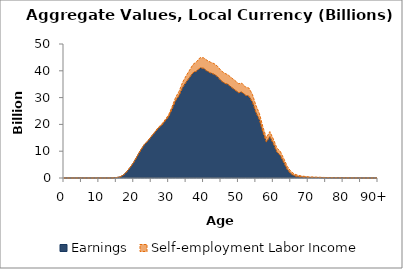
| Category | Earnings | Self-employment Labor Income |
|---|---|---|
| 0 | 0 | 0 |
|  | 0.232 | 0 |
| 2 | 0 | 0 |
| 3 | 0 | 0 |
| 4 | 0.258 | 0 |
| 5 | 0 | 0 |
| 6 | 0.276 | 0.018 |
| 7 | 0.27 | 0 |
| 8 | 0.402 | 0 |
| 9 | 0.326 | 0.056 |
| 10 | 0.452 | 0 |
| 11 | 1.245 | 0.132 |
| 12 | 2.804 | 0.204 |
| 13 | 11.63 | 0.335 |
| 14 | 42.006 | 0.494 |
| 15 | 140.448 | 0.757 |
| 16 | 396.694 | 1.031 |
| 17 | 1054.736 | 1.874 |
| 18 | 2357.46 | 3.252 |
| 19 | 4022.095 | 6.236 |
| 20 | 5855.473 | 10.051 |
| 21 | 8178.244 | 19.518 |
| 22 | 10426.908 | 31.125 |
| 23 | 12424.86 | 52.301 |
| 24 | 13749.482 | 77.743 |
| 25 | 15376.735 | 130.123 |
| 26 | 16923.78 | 210.942 |
| 27 | 18553.115 | 288.292 |
| 28 | 19666.591 | 400.875 |
| 29 | 21271.078 | 514.758 |
| 30 | 22908.288 | 684.786 |
| 31 | 25766.152 | 934.982 |
| 32 | 28871.231 | 1216.348 |
| 33 | 30834.441 | 1542.579 |
| 34 | 33762.702 | 1949.983 |
| 35 | 35733.157 | 2384.905 |
| 36 | 37502.622 | 2753.986 |
| 37 | 39287.086 | 3114.801 |
| 38 | 39905.763 | 3485.902 |
| 39 | 41053.173 | 3851.885 |
| 40 | 40905.181 | 3955.821 |
| 41 | 39895.702 | 4002.395 |
| 42 | 39186.611 | 4020.056 |
| 43 | 38706.688 | 3985.722 |
| 44 | 37817.728 | 3895.958 |
| 45 | 36306.085 | 3787.532 |
| 46 | 35390.489 | 3724.386 |
| 47 | 34917.718 | 3592.681 |
| 48 | 33833.323 | 3549.921 |
| 49 | 32844.412 | 3532.888 |
| 50 | 31840.739 | 3391.011 |
| 51 | 32065.454 | 3289.361 |
| 52 | 30901.319 | 3075.904 |
| 53 | 30497.272 | 3069.514 |
| 54 | 28384.277 | 2836.532 |
| 55 | 24511.76 | 2594.121 |
| 56 | 21738.266 | 2345.625 |
| 57 | 17117.064 | 2007.774 |
| 58 | 13399.36 | 1603.993 |
| 59 | 15447.971 | 1875.001 |
| 60 | 12820.52 | 1731.388 |
| 61 | 9749.589 | 1467.05 |
| 62 | 8391.061 | 1530.512 |
| 63 | 5793.156 | 1432.199 |
| 64 | 3185.905 | 1170.5 |
| 65 | 1625.534 | 860.788 |
| 66 | 841.041 | 653.503 |
| 67 | 515.609 | 521.81 |
| 68 | 342.267 | 422.236 |
| 69 | 280.219 | 313.856 |
| 70 | 215.742 | 216.519 |
| 71 | 204.989 | 192.297 |
| 72 | 196.187 | 139.436 |
| 73 | 175.923 | 124.72 |
| 74 | 131.777 | 99.963 |
| 75 | 107.315 | 81.21 |
| 76 | 102.986 | 64.997 |
| 77 | 74.601 | 53.177 |
| 78 | 73.573 | 48.866 |
| 79 | 63.988 | 33.255 |
| 80 | 59.274 | 25.306 |
| 81 | 37.919 | 20.288 |
| 82 | 30.505 | 16.123 |
| 83 | 18.991 | 11.901 |
| 84 | 10.054 | 6.718 |
| 85 | 4.16 | 3.222 |
| 86 | 0 | 0 |
| 87 | 0 | 0 |
| 88 | 0 | 0 |
| 89 | 0 | 0 |
| 90+ | 0 | 0 |